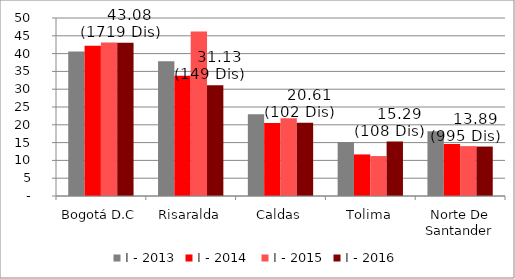
| Category | I - 2013 | I - 2014  | I - 2015 | I - 2016 |
|---|---|---|---|---|
| Bogotá D.C | 40.603 | 42.202 | 43.128 | 43.083 |
| Risaralda | 37.821 | 33.804 | 46.221 | 31.131 |
| Caldas | 22.964 | 20.486 | 21.862 | 20.607 |
| Tolima | 15.141 | 11.679 | 11.219 | 15.295 |
| Norte De Santander | 18.164 | 14.583 | 14.015 | 13.892 |